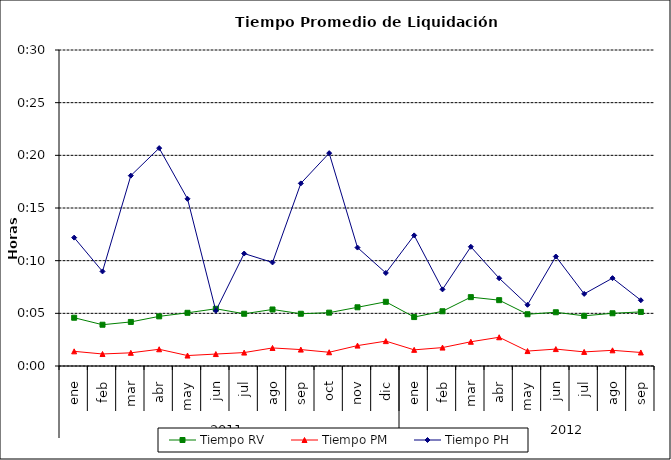
| Category | Tiempo RV | Tiempo PM | Tiempo PH |
|---|---|---|---|
| 0 | 0.003 | 0.001 | 0.009 |
| 1 | 0.003 | 0.001 | 0.006 |
| 2 | 0.003 | 0.001 | 0.013 |
| 3 | 0.003 | 0.001 | 0.014 |
| 4 | 0.004 | 0.001 | 0.011 |
| 5 | 0.004 | 0.001 | 0.004 |
| 6 | 0.003 | 0.001 | 0.007 |
| 7 | 0.004 | 0.001 | 0.007 |
| 8 | 0.003 | 0.001 | 0.012 |
| 9 | 0.004 | 0.001 | 0.014 |
| 10 | 0.004 | 0.001 | 0.008 |
| 11 | 0.004 | 0.002 | 0.006 |
| 12 | 0.003 | 0.001 | 0.009 |
| 13 | 0.004 | 0.001 | 0.005 |
| 14 | 0.005 | 0.002 | 0.008 |
| 15 | 0.004 | 0.002 | 0.006 |
| 16 | 0.003 | 0.001 | 0.004 |
| 17 | 0.004 | 0.001 | 0.007 |
| 18 | 0.003 | 0.001 | 0.005 |
| 19 | 0.004 | 0.001 | 0.006 |
| 20 | 0.004 | 0.001 | 0.004 |